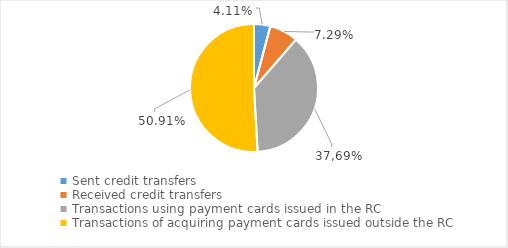
| Category | Series 0 |
|---|---|
| Sent credit transfers | 4556556 |
| Received credit transfers | 8087429 |
| Transactions using payment cards issued in the RC | 41825082 |
| Transactions of acquiring payment cards issued outside the RC | 56480883 |